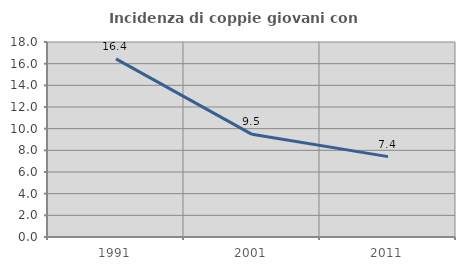
| Category | Incidenza di coppie giovani con figli |
|---|---|
| 1991.0 | 16.443 |
| 2001.0 | 9.476 |
| 2011.0 | 7.42 |